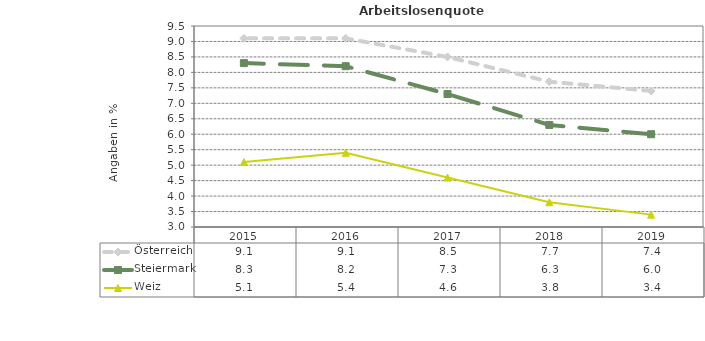
| Category | Österreich | Steiermark | Weiz |
|---|---|---|---|
| 2019.0 | 7.4 | 6 | 3.4 |
| 2018.0 | 7.7 | 6.3 | 3.8 |
| 2017.0 | 8.5 | 7.3 | 4.6 |
| 2016.0 | 9.1 | 8.2 | 5.4 |
| 2015.0 | 9.1 | 8.3 | 5.1 |